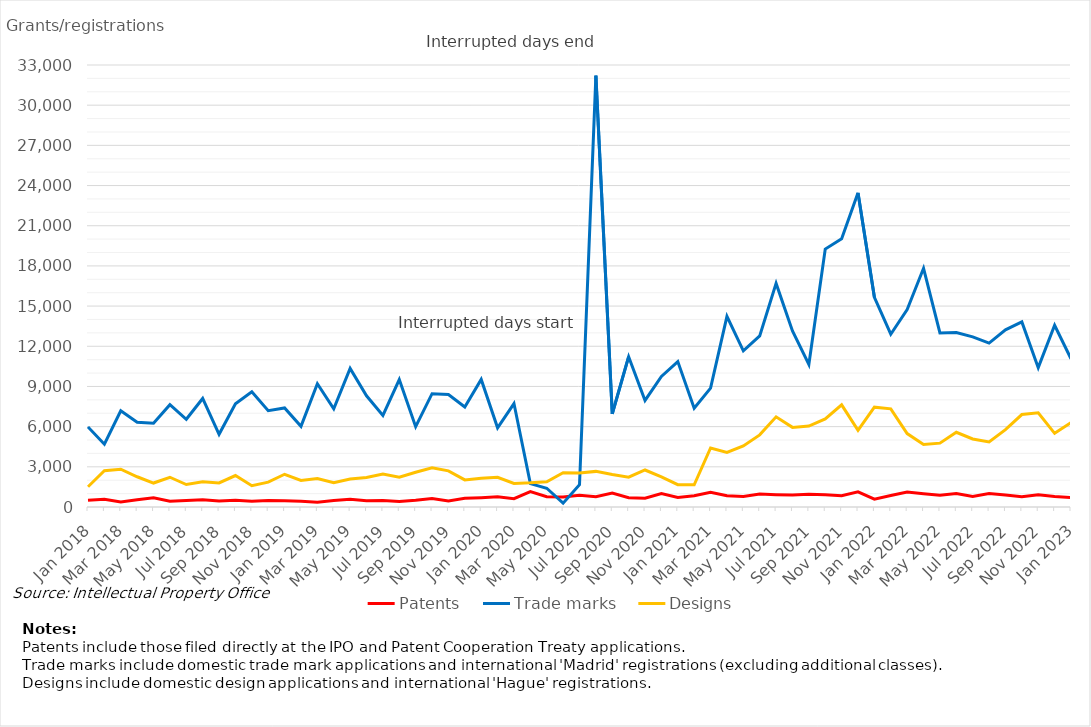
| Category | Patents | Trade marks | Designs |
|---|---|---|---|
| Jan 2018 | 495 | 5979 | 1512 |
| Feb 2018 | 574 | 4687 | 2704 |
| Mar 2018 | 370 | 7179 | 2825 |
| Apr 2018 | 543 | 6334 | 2259 |
| May 2018 | 690 | 6253 | 1789 |
| Jun 2018 | 424 | 7637 | 2222 |
| Jul 2018 | 486 | 6551 | 1678 |
| Aug 2018 | 536 | 8104 | 1878 |
| Sep 2018 | 450 | 5429 | 1795 |
| Oct 2018 | 498 | 7701 | 2348 |
| Nov 2018 | 432 | 8603 | 1592 |
| Dec 2018 | 484 | 7193 | 1859 |
| Jan 2019 | 474 | 7394 | 2444 |
| Feb 2019 | 426 | 6023 | 1987 |
| Mar 2019 | 363 | 9208 | 2125 |
| Apr 2019 | 488 | 7336 | 1810 |
| May 2019 | 573 | 10344 | 2096 |
| Jun 2019 | 471 | 8304 | 2202 |
| Jul 2019 | 489 | 6840 | 2464 |
| Aug 2019 | 420 | 9519 | 2218 |
| Sep 2019 | 500 | 5992 | 2596 |
| Oct 2019 | 634 | 8460 | 2926 |
| Nov 2019 | 455 | 8403 | 2700 |
| Dec 2019 | 654 | 7465 | 2021 |
| Jan 2020 | 696 | 9525 | 2145 |
| Feb 2020 | 756 | 5909 | 2219 |
| Mar 2020 | 622 | 7722 | 1757 |
| Apr 2020 | 1143 | 1742 | 1803 |
| May 2020 | 768 | 1399 | 1888 |
| Jun 2020 | 740 | 282 | 2564 |
| Jul 2020 | 878 | 1659 | 2539 |
| Aug 2020 | 771 | 32204 | 2659 |
| Sep 2020 | 1042 | 6950 | 2425 |
| Oct 2020 | 697 | 11222 | 2223 |
| Nov 2020 | 649 | 7956 | 2763 |
| Dec 2020 | 1010 | 9751 | 2252 |
| Jan 2021 | 708 | 10856 | 1665 |
| Feb 2021 | 838 | 7381 | 1660 |
| Mar 2021 | 1107 | 8879 | 4408 |
| Apr 2021 | 838 | 14233 | 4074 |
| May 2021 | 788 | 11655 | 4562 |
| Jun 2021 | 972 | 12777 | 5385 |
| Jul 2021 | 918 | 16695 | 6731 |
| Aug 2021 | 887 | 13147 | 5944 |
| Sep 2021 | 947 | 10648 | 6041 |
| Oct 2021 | 920 | 19255 | 6577 |
| Nov 2021 | 841 | 20029 | 7629 |
| Dec 2021 | 1131 | 23454 | 5719 |
| Jan 2022 | 585 | 15660 | 7455 |
| Feb 2022 | 860 | 12899 | 7329 |
| Mar 2022 | 1111 | 14745 | 5482 |
| Apr 2022 | 990 | 17821 | 4663 |
| May 2022 | 883 | 12994 | 4767 |
| Jun 2022 | 1010 | 13033 | 5577 |
| Jul 2022 | 788 | 12702 | 5082 |
| Aug 2022 | 1007 | 12235 | 4856 |
| Sep 2022 | 889 | 13226 | 5776 |
| Oct 2022 | 758 | 13816 | 6904 |
| Nov 2022 | 920 | 10403 | 7027 |
| Dec 2022 | 777 | 13568 | 5499 |
| Jan 2023 | 708 | 11066 | 6304 |